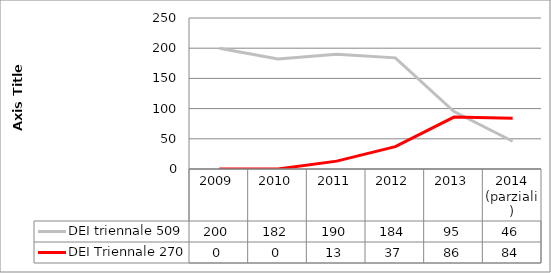
| Category | DEI triennale 509 | DEI Triennale 270 |
|---|---|---|
| 2009 | 200 | 0 |
| 2010 | 182 | 0 |
| 2011 | 190 | 13 |
| 2012 | 184 | 37 |
| 2013 | 95 | 86 |
| 2014
(parziali) | 46 | 84 |